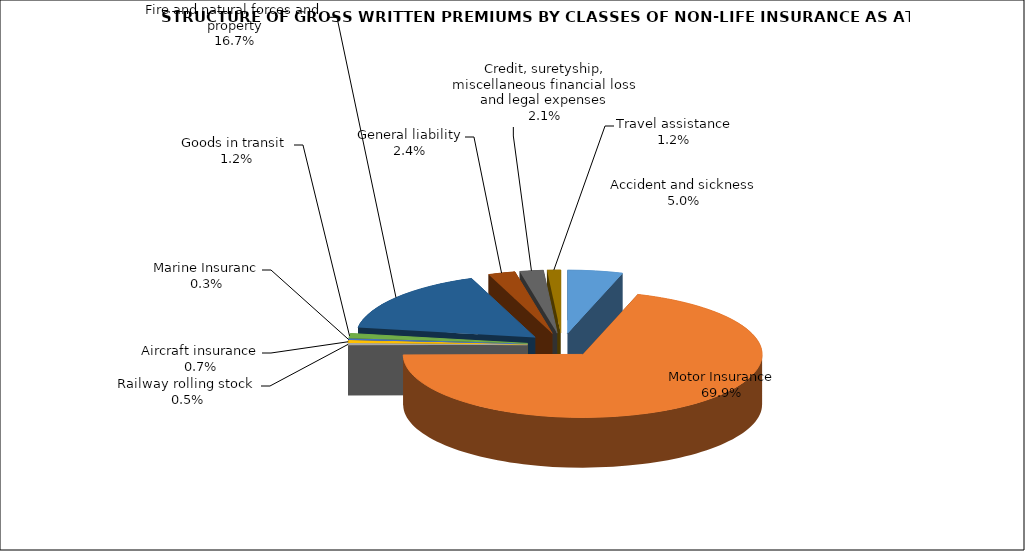
| Category | Accident and sickness |
|---|---|
| Accident and sickness | 0.05 |
| Motor Insurance | 0.699 |
| Railway rolling stock  | 0.005 |
| Aircraft insurance | 0.007 |
| Marine Insuranc | 0.003 |
| Goods in transit  | 0.012 |
| Fire and natural forces and property | 0.167 |
| General liability | 0.024 |
| Credit, suretyship, miscellaneous financial loss and legal expenses | 0.021 |
| Travel assistance | 0.012 |